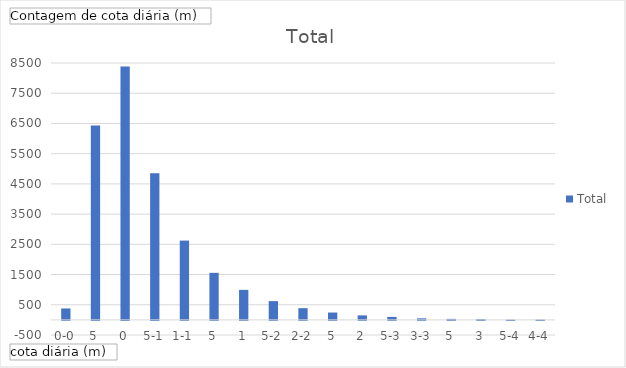
| Category | Total |
|---|---|
| 0-0,5 | 378 |
| 0,5-1 | 6432 |
| 1-1,5 | 8386 |
| 1,5-2 | 4854 |
| 2-2,5 | 2624 |
| 2,5-3 | 1557 |
| 3-3,5 | 993 |
| 3,5-4 | 621 |
| 4-4,5 | 387 |
| 4,5-5 | 243 |
| 5-5,5 | 149 |
| 5,5-6 | 99 |
| 6-6,5 | 51 |
| 6,5-7 | 33 |
| 7-7,5 | 27 |
| 7,5-8 | 9 |
| 8-8,5 | 10 |